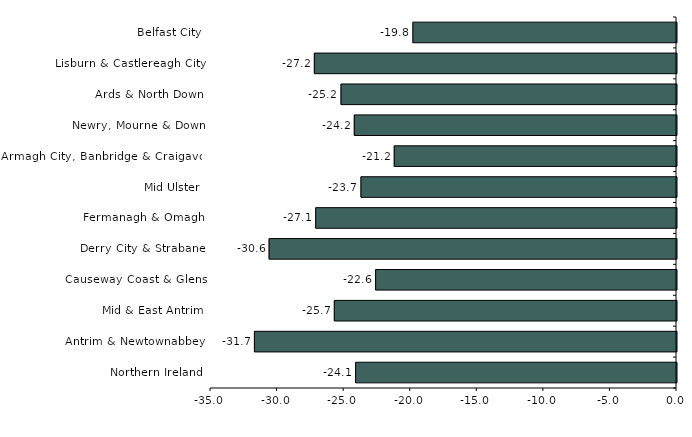
| Category | Series 0 |
|---|---|
| Belfast City | -19.8 |
| Lisburn & Castlereagh City | -27.2 |
| Ards & North Down | -25.2 |
| Newry, Mourne & Down | -24.2 |
| Armagh City, Banbridge & Craigavon | -21.2 |
| Mid Ulster | -23.7 |
| Fermanagh & Omagh | -27.1 |
| Derry City & Strabane | -30.6 |
| Causeway Coast & Glens | -22.6 |
| Mid & East Antrim | -25.7 |
| Antrim & Newtownabbey | -31.7 |
| Northern Ireland | -24.1 |